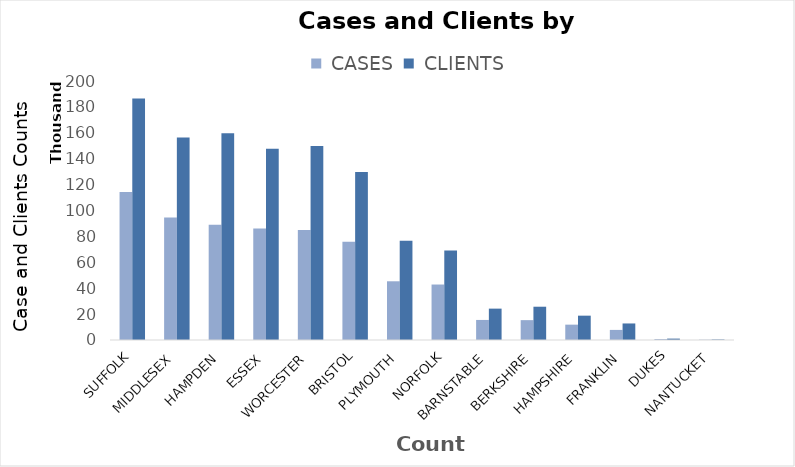
| Category |  CASES |  CLIENTS |
|---|---|---|
| SUFFOLK | 114272 | 186452 |
| MIDDLESEX | 94591 | 156293 |
| HAMPDEN | 89075 | 159666 |
| ESSEX | 86138 | 147766 |
| WORCESTER | 85037 | 149836 |
| BRISTOL | 75792 | 129726 |
| PLYMOUTH | 45339 | 76737 |
| NORFOLK | 42841 | 69168 |
| BARNSTABLE | 15484 | 24223 |
| BERKSHIRE | 15339 | 25700 |
| HAMPSHIRE | 11851 | 18792 |
| FRANKLIN | 7791 | 12771 |
| DUKES | 719 | 1074 |
| NANTUCKET | 230 | 404 |